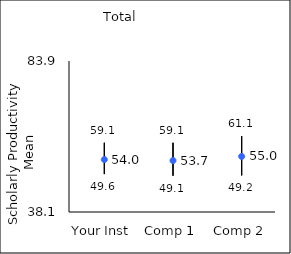
| Category | 25th percentile | 75th percentile | Mean |
|---|---|---|---|
| Your Inst | 49.6 | 59.1 | 54.01 |
| Comp 1 | 49.1 | 59.1 | 53.71 |
| Comp 2 | 49.2 | 61.1 | 54.95 |